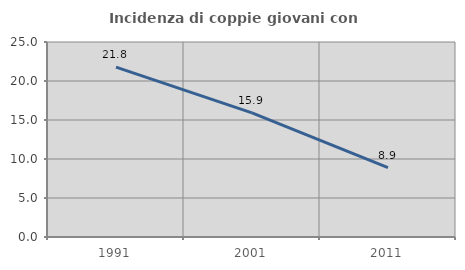
| Category | Incidenza di coppie giovani con figli |
|---|---|
| 1991.0 | 21.778 |
| 2001.0 | 15.91 |
| 2011.0 | 8.904 |